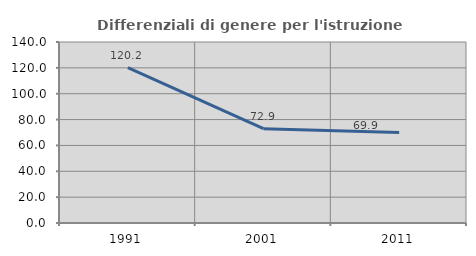
| Category | Differenziali di genere per l'istruzione superiore |
|---|---|
| 1991.0 | 120.152 |
| 2001.0 | 72.914 |
| 2011.0 | 69.94 |